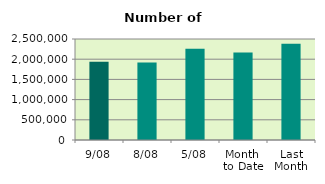
| Category | Series 0 |
|---|---|
| 9/08 | 1935442 |
| 8/08 | 1920002 |
| 5/08 | 2256582 |
| Month 
to Date | 2168342.286 |
| Last
Month | 2380266.19 |